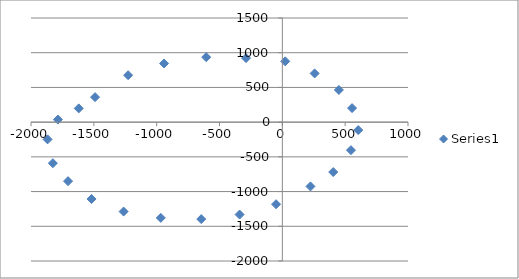
| Category | Series 0 |
|---|---|
| 405.0 | -719 |
| 224.0 | -926 |
| -50.0 | -1182 |
| -340.0 | -1331 |
| -645.0 | -1396 |
| -967.0 | -1379 |
| -1263.0 | -1288 |
| -1518.0 | -1107 |
| -1705.0 | -850 |
| -1826.0 | -591 |
| -1868.0 | -248 |
| -1786.0 | 37 |
| -1620.0 | 198 |
| -1490.0 | 360 |
| -1227.0 | 676 |
| -941.0 | 845 |
| -606.0 | 936 |
| -289.0 | 923 |
| 23.0 | 876 |
| 257.0 | 702 |
| 450.0 | 464 |
| 555.0 | 202 |
| 604.0 | -114 |
| 546.0 | -404 |